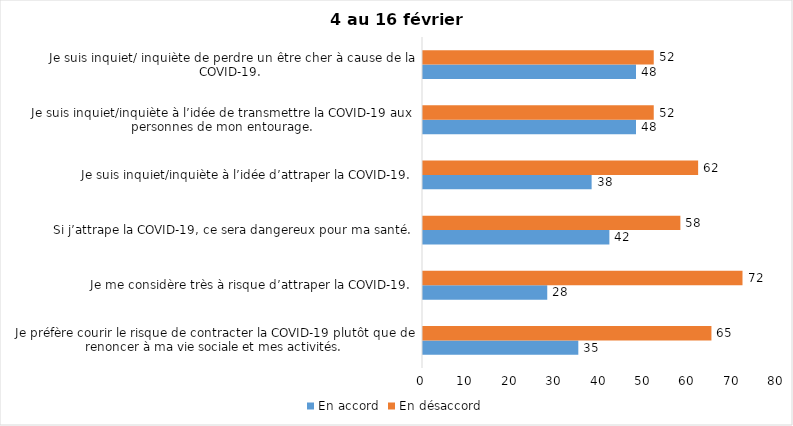
| Category | En accord | En désaccord |
|---|---|---|
| Je préfère courir le risque de contracter la COVID-19 plutôt que de renoncer à ma vie sociale et mes activités. | 35 | 65 |
| Je me considère très à risque d’attraper la COVID-19. | 28 | 72 |
| Si j’attrape la COVID-19, ce sera dangereux pour ma santé. | 42 | 58 |
| Je suis inquiet/inquiète à l’idée d’attraper la COVID-19. | 38 | 62 |
| Je suis inquiet/inquiète à l’idée de transmettre la COVID-19 aux personnes de mon entourage. | 48 | 52 |
| Je suis inquiet/ inquiète de perdre un être cher à cause de la COVID-19. | 48 | 52 |